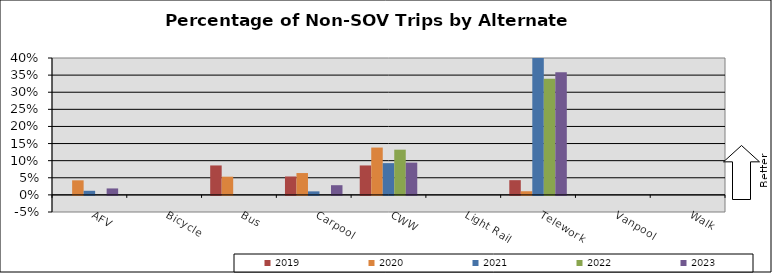
| Category | 2019 | 2020 | 2021 | 2022 | 2023 |
|---|---|---|---|---|---|
| AFV | 0 | 0.043 | 0.012 | 0 | 0.019 |
| Bicycle | 0 | 0 | 0 | 0 | 0 |
| Bus | 0.086 | 0.053 | 0 | 0 | 0 |
| Carpool | 0.054 | 0.064 | 0.01 | 0 | 0.028 |
| CWW | 0.086 | 0.138 | 0.093 | 0.132 | 0.094 |
| Light Rail | 0 | 0 | 0 | 0 | 0 |
| Telework | 0.043 | 0.011 | 0.536 | 0.34 | 0.358 |
| Vanpool | 0 | 0 | 0 | 0 | 0 |
| Walk | 0 | 0 | 0 | 0 | 0 |